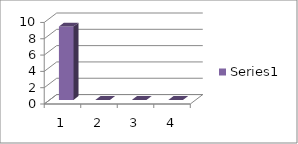
| Category | Series 0 |
|---|---|
| 0 | 9 |
| 1 | 0 |
| 2 | 0 |
| 3 | 0 |